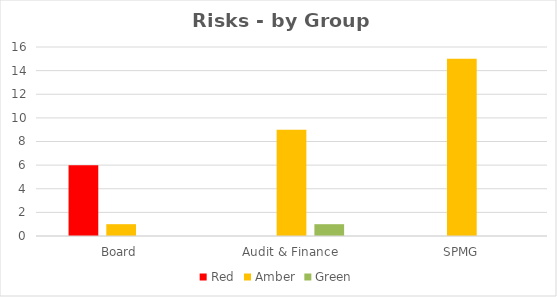
| Category | Red | Amber | Green |
|---|---|---|---|
| Board | 6 | 1 | 0 |
| Audit & Finance | 0 | 9 | 1 |
| SPMG | 0 | 15 | 0 |